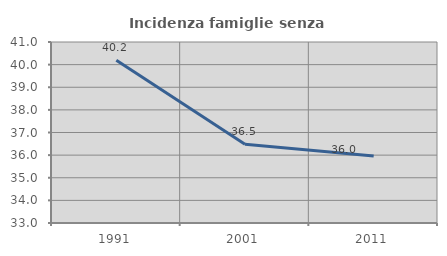
| Category | Incidenza famiglie senza nuclei |
|---|---|
| 1991.0 | 40.191 |
| 2001.0 | 36.48 |
| 2011.0 | 35.961 |